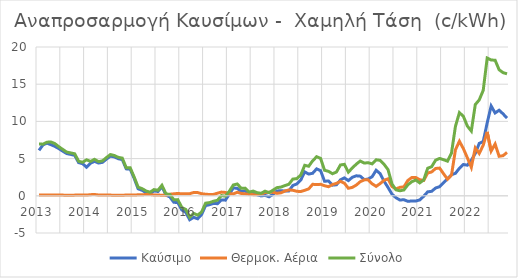
| Category | Καύσιμο | Θερμοκ. Αέρια | Σύνολο |
|---|---|---|---|
| 2013.0 | 6.108 | 0.093 | 6.972 |
| 2013.0 | 6.834 | 0.098 | 6.94 |
| 2013.0 | 7.081 | 0.12 | 7.208 |
| 2013.0 | 6.873 | 0.12 | 7.234 |
| 2013.0 | 6.645 | 0.124 | 7.019 |
| 2013.0 | 6.344 | 0.104 | 6.6 |
| 2013.0 | 6 | 0.094 | 6.233 |
| 2013.0 | 5.672 | 0.075 | 5.873 |
| 2013.0 | 5.566 | 0.074 | 5.763 |
| 2013.0 | 5.441 | 0.092 | 5.649 |
| 2013.0 | 4.459 | 0.104 | 4.64 |
| 2013.0 | 4.32 | 0.112 | 4.503 |
| 2014.0 | 3.838 | 0.096 | 4.838 |
| 2014.0 | 4.385 | 0.152 | 4.621 |
| 2014.0 | 4.632 | 0.177 | 4.903 |
| 2014.0 | 4.405 | 0.111 | 4.595 |
| 2014.0 | 4.494 | 0.117 | 4.691 |
| 2014.0 | 4.928 | 0.106 | 5.135 |
| 2014.0 | 5.33 | 0.095 | 5.543 |
| 2014.0 | 5.23 | 0.074 | 5.417 |
| 2014.0 | 4.982 | 0.073 | 5.166 |
| 2014.0 | 4.873 | 0.084 | 5.065 |
| 2014.0 | 3.62 | 0.095 | 3.771 |
| 2014.0 | 3.583 | 0.108 | 3.763 |
| 2015.0 | 2.34 | 0.098 | 2.522 |
| 2015.0 | 0.94 | 0.137 | 1.158 |
| 2015.0 | 0.741 | 0.156 | 0.964 |
| 2015.0 | 0.419 | 0.16 | 0.651 |
| 2015.0 | 0.262 | 0.174 | 0.481 |
| 2015.0 | 0.665 | 0.11 | 0.835 |
| 2015.0 | 0.576 | 0.101 | 0.745 |
| 2015.0 | 1.23 | 0.08 | 1.41 |
| 2015.0 | 0.107 | 0.072 | 0.275 |
| 2015.0 | -0.154 | 0.218 | 0.175 |
| 2015.0 | -0.873 | 0.263 | -0.523 |
| 2015.0 | -0.907 | 0.318 | -0.514 |
| 2016.0 | -1.898 | 0.265 | -1.569 |
| 2016.0 | -2.216 | 0.291 | -1.835 |
| 2016.0 | -3.221 | 0.28 | -2.885 |
| 2016.0 | -2.897 | 0.449 | -2.359 |
| 2016.0 | -3.09 | 0.435 | -2.597 |
| 2016.0 | -2.515 | 0.284 | -2.175 |
| 2016.0 | -1.317 | 0.212 | -0.989 |
| 2016.0 | -1.196 | 0.174 | -0.914 |
| 2016.0 | -1.028 | 0.188 | -0.731 |
| 2016.0 | -1.058 | 0.349 | -0.604 |
| 2016.0 | -0.556 | 0.498 | 0.034 |
| 2016.0 | -0.583 | 0.451 | -0.057 |
| 2017.0 | 0.221 | 0.271 | 0.624 |
| 2017.0 | 1.061 | 0.259 | 1.455 |
| 2017.0 | 0.998 | 0.476 | 1.588 |
| 2017.0 | 0.577 | 0.311 | 1 |
| 2017.0 | 0.667 | 0.265 | 1.029 |
| 2017.0 | 0.206 | 0.211 | 0.5 |
| 2017.0 | 0.356 | 0.154 | 0.636 |
| 2017.0 | 0.128 | 0.159 | 0.419 |
| 2017.0 | -0.012 | 0.227 | 0.338 |
| 2017.0 | 0.059 | 0.432 | 0.621 |
| 2017.0 | -0.135 | 0.473 | 0.419 |
| 2017.0 | 0.197 | 0.469 | 0.758 |
| 2018.0 | 0.654 | 0.335 | 1.098 |
| 2018.0 | 0.679 | 0.401 | 1.17 |
| 2018.0 | 0.65 | 0.64 | 1.376 |
| 2018.0 | 0.653 | 0.79 | 1.547 |
| 2018.0 | 1.385 | 0.745 | 2.246 |
| 2018.0 | 1.591 | 0.606 | 2.307 |
| 2018.0 | 2.116 | 0.571 | 2.795 |
| 2018.0 | 3.213 | 0.74 | 4.099 |
| 2018.0 | 2.92 | 0.929 | 3.973 |
| 2018.0 | 3.031 | 1.544 | 4.71 |
| 2018.0 | 3.621 | 1.514 | 5.251 |
| 2018.0 | 3.38 | 1.542 | 5.03 |
| 2019.0 | 1.952 | 1.355 | 3.432 |
| 2019.0 | 1.997 | 1.22 | 3.286 |
| 2019.0 | 1.427 | 1.51 | 2.969 |
| 2019.0 | 1.482 | 1.678 | 3.197 |
| 2019.0 | 2.138 | 1.949 | 4.143 |
| 2019.0 | 2.406 | 1.694 | 4.228 |
| 2019.0 | 2.044 | 1.012 | 3.178 |
| 2019.0 | 2.488 | 1.132 | 3.746 |
| 2019.0 | 2.688 | 1.444 | 4.255 |
| 2019.0 | 2.641 | 1.897 | 4.676 |
| 2019.0 | 2.17 | 2.143 | 4.403 |
| 2019.0 | 2.26 | 2.144 | 4.448 |
| 2020.0 | 2.567 | 1.613 | 4.292 |
| 2020.0 | 3.433 | 1.269 | 4.844 |
| 2020.0 | 2.981 | 1.635 | 4.766 |
| 2020.0 | 1.96 | 2.089 | 4.23 |
| 2020.0 | 1.124 | 2.275 | 3.523 |
| 2020.0 | 0.217 | 1.248 | 1.583 |
| 2020.0 | -0.258 | 0.93 | 0.804 |
| 2020.0 | -0.566 | 1.138 | 0.676 |
| 2020.0 | -0.527 | 1.202 | 0.785 |
| 2020.0 | -0.74 | 2.061 | 1.477 |
| 2020.0 | -0.699 | 2.458 | 1.898 |
| 2020.0 | -0.699 | 2.458 | 2.118 |
| 2021.0 | -0.555 | 2.159 | 1.735 |
| 2021.0 | -0.058 | 2.07 | 2.138 |
| 2021.0 | 0.533 | 3.067 | 3.704 |
| 2021.0 | 0.602 | 3.207 | 3.91 |
| 2021.0 | 1.049 | 3.671 | 4.79 |
| 2021.0 | 1.219 | 3.728 | 5.022 |
| 2021.0 | 1.765 | 2.964 | 4.853 |
| 2021.0 | 2.302 | 2.234 | 4.652 |
| 2021.0 | 2.834 | 2.779 | 5.744 |
| 2021.0 | 3.024 | 6.188 | 9.345 |
| 2021.0 | 3.708 | 7.333 | 11.177 |
| 2021.0 | 4.21 | 6.334 | 10.678 |
| 2022.0 | 4.113 | 5.111 | 9.374 |
| 2022.0 | 4.777 | 3.824 | 8.702 |
| 2022.0 | 5.699 | 6.436 | 12.262 |
| 2022.0 | 7.048 | 5.69 | 12.896 |
| 2022.0 | 7.294 | 6.802 | 14.171 |
| 2022.0 | 9.796 | 8.589 | 18.513 |
| 2022.0 | 12.071 | 6.015 | 18.253 |
| 2022.0 | 11.134 | 6.959 | 18.22 |
| 2022.0 | 11.503 | 5.314 | 16.953 |
| 2022.0 | 11.015 | 5.392 | 16.551 |
| 2022.0 | 10.438 | 5.835 | 16.399 |